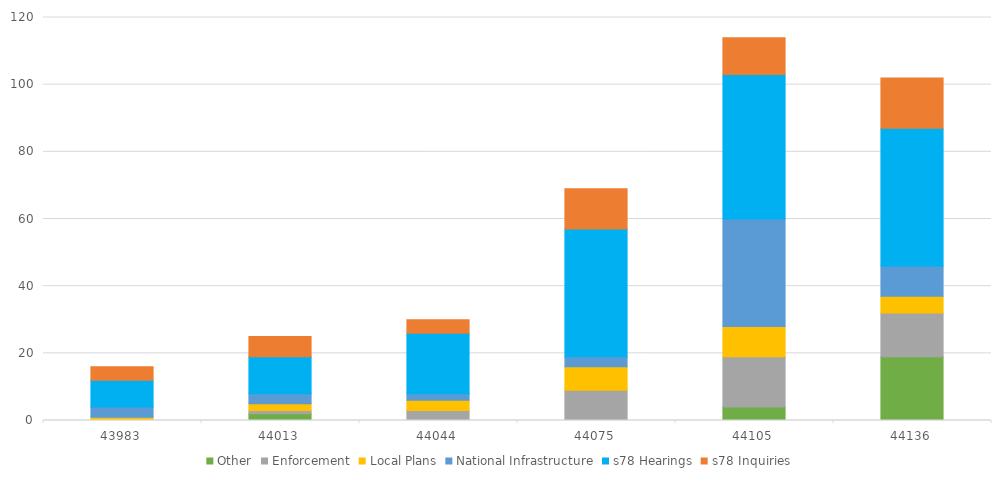
| Category | Other | Enforcement | Local Plans | National Infrastructure | s78 Hearings | s78 Inquiries |
|---|---|---|---|---|---|---|
| 43983.0 | 0 | 0 | 1 | 3 | 8 | 4 |
| 44013.0 | 2 | 1 | 2 | 3 | 11 | 6 |
| 44044.0 | 0 | 3 | 3 | 2 | 18 | 4 |
| 44075.0 | 0 | 9 | 7 | 3 | 38 | 12 |
| 44105.0 | 4 | 15 | 9 | 32 | 43 | 11 |
| 44136.0 | 19 | 13 | 5 | 9 | 41 | 15 |